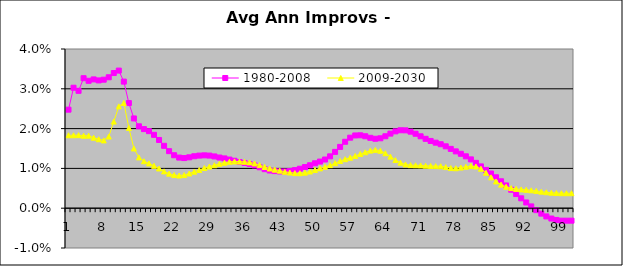
| Category | 1980-2008 | 2009-2030 |
|---|---|---|
| 0 | 0.025 | 0.018 |
| 1 | 0.03 | 0.018 |
| 2 | 0.029 | 0.018 |
| 3 | 0.033 | 0.018 |
| 4 | 0.032 | 0.018 |
| 5 | 0.032 | 0.018 |
| 6 | 0.032 | 0.017 |
| 7 | 0.032 | 0.017 |
| 8 | 0.033 | 0.018 |
| 9 | 0.034 | 0.022 |
| 10 | 0.035 | 0.026 |
| 11 | 0.032 | 0.026 |
| 12 | 0.026 | 0.02 |
| 13 | 0.023 | 0.015 |
| 14 | 0.021 | 0.013 |
| 15 | 0.02 | 0.012 |
| 16 | 0.019 | 0.011 |
| 17 | 0.018 | 0.011 |
| 18 | 0.017 | 0.01 |
| 19 | 0.016 | 0.009 |
| 20 | 0.014 | 0.009 |
| 21 | 0.013 | 0.008 |
| 22 | 0.013 | 0.008 |
| 23 | 0.013 | 0.008 |
| 24 | 0.013 | 0.009 |
| 25 | 0.013 | 0.009 |
| 26 | 0.013 | 0.01 |
| 27 | 0.013 | 0.01 |
| 28 | 0.013 | 0.01 |
| 29 | 0.013 | 0.011 |
| 30 | 0.013 | 0.011 |
| 31 | 0.013 | 0.011 |
| 32 | 0.012 | 0.012 |
| 33 | 0.012 | 0.012 |
| 34 | 0.012 | 0.012 |
| 35 | 0.011 | 0.012 |
| 36 | 0.011 | 0.012 |
| 37 | 0.011 | 0.011 |
| 38 | 0.01 | 0.011 |
| 39 | 0.01 | 0.01 |
| 40 | 0.009 | 0.01 |
| 41 | 0.009 | 0.01 |
| 42 | 0.009 | 0.009 |
| 43 | 0.009 | 0.009 |
| 44 | 0.009 | 0.009 |
| 45 | 0.01 | 0.009 |
| 46 | 0.01 | 0.009 |
| 47 | 0.01 | 0.009 |
| 48 | 0.011 | 0.009 |
| 49 | 0.011 | 0.01 |
| 50 | 0.012 | 0.01 |
| 51 | 0.012 | 0.01 |
| 52 | 0.013 | 0.011 |
| 53 | 0.014 | 0.011 |
| 54 | 0.015 | 0.012 |
| 55 | 0.017 | 0.012 |
| 56 | 0.018 | 0.013 |
| 57 | 0.018 | 0.013 |
| 58 | 0.018 | 0.014 |
| 59 | 0.018 | 0.014 |
| 60 | 0.018 | 0.014 |
| 61 | 0.017 | 0.015 |
| 62 | 0.018 | 0.014 |
| 63 | 0.018 | 0.014 |
| 64 | 0.019 | 0.013 |
| 65 | 0.019 | 0.012 |
| 66 | 0.02 | 0.011 |
| 67 | 0.02 | 0.011 |
| 68 | 0.019 | 0.011 |
| 69 | 0.019 | 0.011 |
| 70 | 0.018 | 0.011 |
| 71 | 0.017 | 0.011 |
| 72 | 0.017 | 0.011 |
| 73 | 0.016 | 0.011 |
| 74 | 0.016 | 0.011 |
| 75 | 0.016 | 0.01 |
| 76 | 0.015 | 0.01 |
| 77 | 0.014 | 0.01 |
| 78 | 0.014 | 0.01 |
| 79 | 0.013 | 0.01 |
| 80 | 0.012 | 0.011 |
| 81 | 0.011 | 0.01 |
| 82 | 0.011 | 0.01 |
| 83 | 0.01 | 0.009 |
| 84 | 0.009 | 0.008 |
| 85 | 0.008 | 0.007 |
| 86 | 0.007 | 0.006 |
| 87 | 0.006 | 0.005 |
| 88 | 0.005 | 0.005 |
| 89 | 0.004 | 0.005 |
| 90 | 0.002 | 0.005 |
| 91 | 0.001 | 0.005 |
| 92 | 0 | 0.004 |
| 93 | 0 | 0.004 |
| 94 | -0.001 | 0.004 |
| 95 | -0.002 | 0.004 |
| 96 | -0.003 | 0.004 |
| 97 | -0.003 | 0.004 |
| 98 | -0.003 | 0.004 |
| 99 | -0.003 | 0.004 |
| 100 | -0.003 | 0.004 |